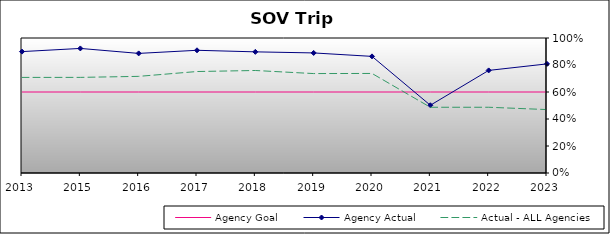
| Category | Agency Goal | Agency Actual | Actual - ALL Agencies |
|---|---|---|---|
| 2013.0 | 0.6 | 0.899 | 0.708 |
| 2015.0 | 0.6 | 0.923 | 0.708 |
| 2016.0 | 0.6 | 0.886 | 0.716 |
| 2017.0 | 0.6 | 0.909 | 0.752 |
| 2018.0 | 0.6 | 0.897 | 0.759 |
| 2019.0 | 0.6 | 0.889 | 0.736 |
| 2020.0 | 0.6 | 0.864 | 0.737 |
| 2021.0 | 0.6 | 0.502 | 0.487 |
| 2022.0 | 0.6 | 0.76 | 0.487 |
| 2023.0 | 0.6 | 0.808 | 0.47 |